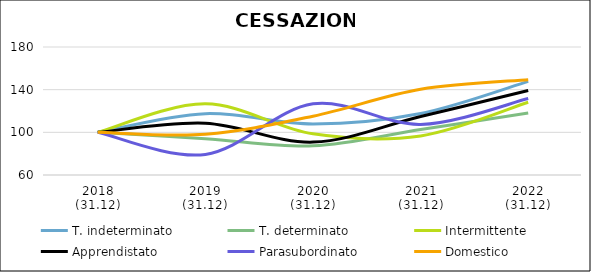
| Category | T. indeterminato | T. determinato | Intermittente | Apprendistato | Parasubordinato | Domestico |
|---|---|---|---|---|---|---|
| 2018
(31.12) | 100 | 100 | 100 | 100 | 100 | 100 |
| 2019
(31.12) | 117.486 | 94.079 | 126.761 | 108.519 | 79.296 | 98.17 |
| 2020
(31.12) | 107.863 | 87.363 | 98.592 | 90.826 | 126.708 | 115.141 |
| 2021
(31.12) | 117.621 | 102.579 | 96.62 | 114.81 | 107.453 | 140.349 |
| 2022
(31.12) | 147.737 | 118.174 | 128.169 | 139.187 | 131.677 | 149.334 |